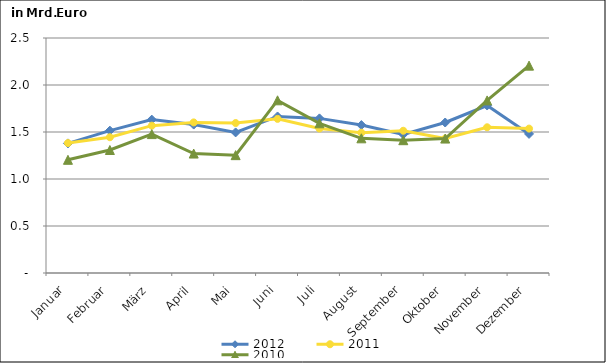
| Category | 2012 | 2011 | 2010 |
|---|---|---|---|
| Januar | 1.379 | 1.382 | 1.204 |
| Februar | 1.514 | 1.444 | 1.308 |
| März | 1.632 | 1.567 | 1.478 |
| April | 1.579 | 1.602 | 1.271 |
| Mai | 1.496 | 1.595 | 1.254 |
| Juni | 1.665 | 1.64 | 1.837 |
| Juli | 1.645 | 1.537 | 1.593 |
| August | 1.574 | 1.493 | 1.433 |
| September | 1.475 | 1.513 | 1.413 |
| Oktober | 1.601 | 1.432 | 1.43 |
| November | 1.782 | 1.55 | 1.836 |
| Dezember | 1.48 | 1.536 | 2.206 |